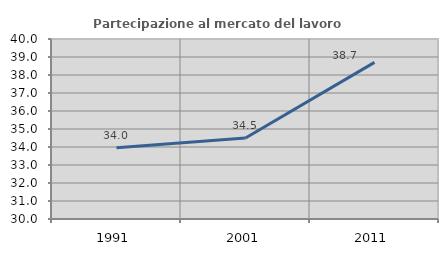
| Category | Partecipazione al mercato del lavoro  femminile |
|---|---|
| 1991.0 | 33.961 |
| 2001.0 | 34.5 |
| 2011.0 | 38.699 |